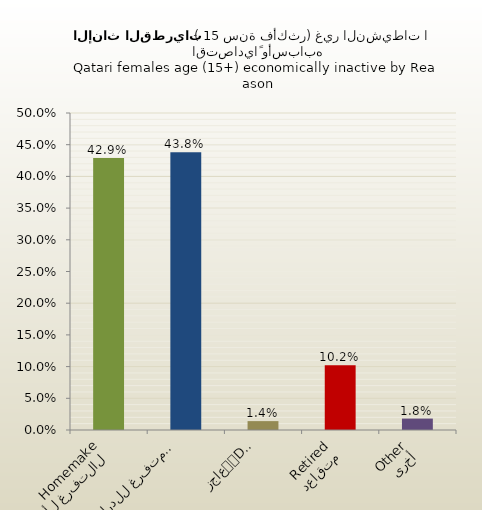
| Category | الاناث القطريات |
|---|---|
| التفرغ لأعمال المنزل
Homemaker | 0.429 |
| متفرغ للدراسة
Student | 0.438 |
| عاجز
Disabled | 0.014 |
| متقاعد
Retired | 0.102 |
| أخرى
Other | 0.018 |